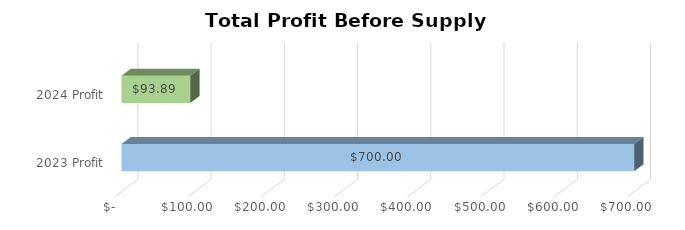
| Category | Total |
|---|---|
| 2023 Profit | 700 |
| 2024 Profit | 93.89 |